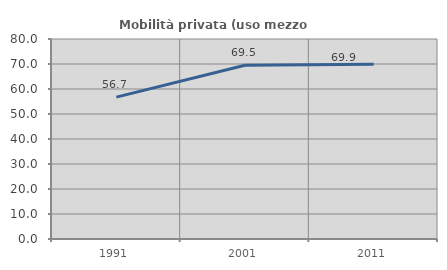
| Category | Mobilità privata (uso mezzo privato) |
|---|---|
| 1991.0 | 56.742 |
| 2001.0 | 69.481 |
| 2011.0 | 69.88 |